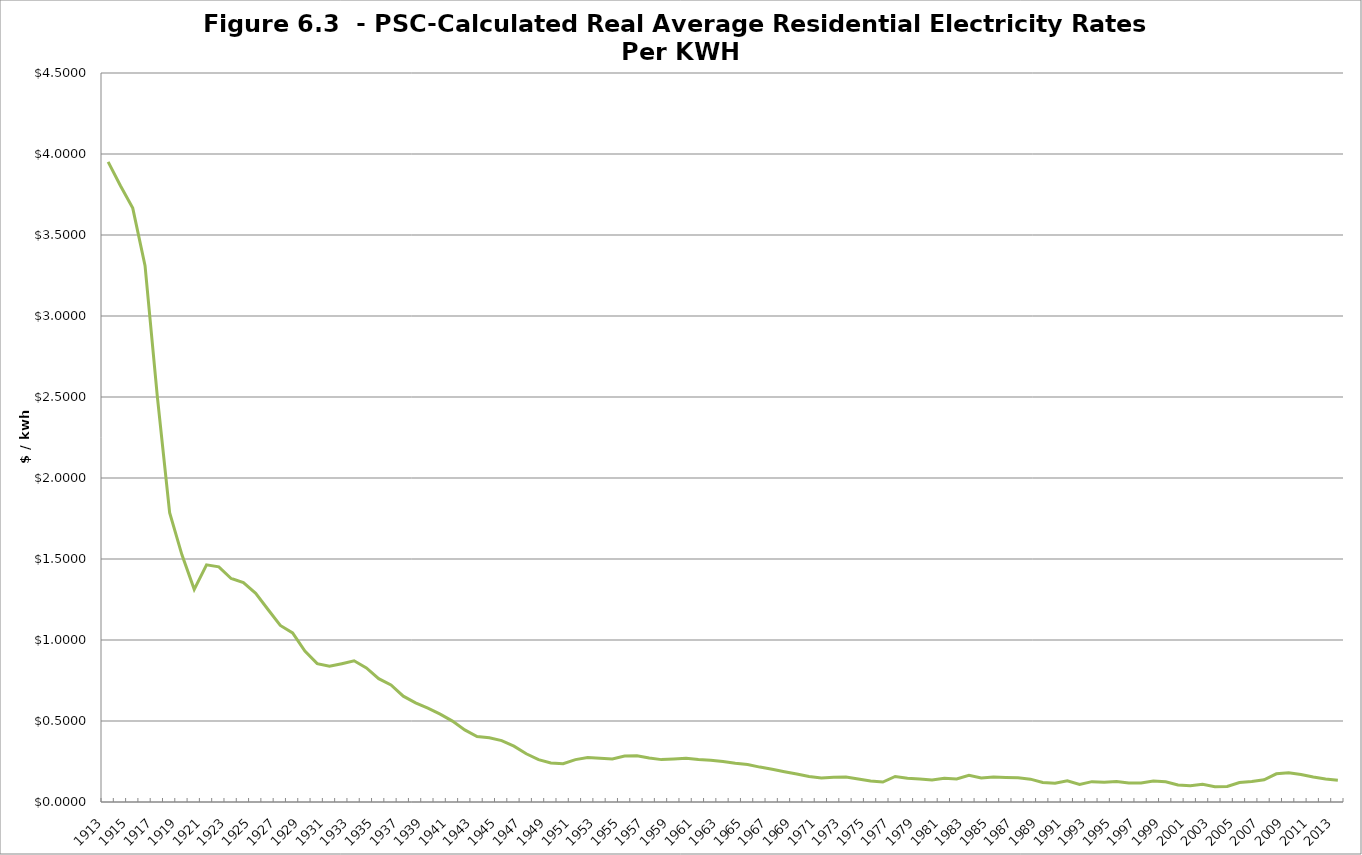
| Category | Real Rates 
per kwh |
|---|---|
| 1913.0 | 3.951 |
| 1914.0 | 3.804 |
| 1915.0 | 3.666 |
| 1916.0 | 3.311 |
| 1917.0 | 2.503 |
| 1918.0 | 1.786 |
| 1919.0 | 1.526 |
| 1920.0 | 1.313 |
| 1921.0 | 1.464 |
| 1922.0 | 1.451 |
| 1923.0 | 1.38 |
| 1924.0 | 1.354 |
| 1925.0 | 1.288 |
| 1926.0 | 1.188 |
| 1927.0 | 1.09 |
| 1928.0 | 1.044 |
| 1929.0 | 0.932 |
| 1930.0 | 0.854 |
| 1931.0 | 0.837 |
| 1932.0 | 0.854 |
| 1933.0 | 0.872 |
| 1934.0 | 0.827 |
| 1935.0 | 0.762 |
| 1936.0 | 0.722 |
| 1937.0 | 0.653 |
| 1938.0 | 0.612 |
| 1939.0 | 0.579 |
| 1940.0 | 0.543 |
| 1941.0 | 0.499 |
| 1942.0 | 0.445 |
| 1943.0 | 0.405 |
| 1944.0 | 0.396 |
| 1945.0 | 0.379 |
| 1946.0 | 0.345 |
| 1947.0 | 0.298 |
| 1948.0 | 0.261 |
| 1949.0 | 0.241 |
| 1950.0 | 0.236 |
| 1951.0 | 0.262 |
| 1952.0 | 0.275 |
| 1953.0 | 0.27 |
| 1954.0 | 0.265 |
| 1955.0 | 0.284 |
| 1956.0 | 0.285 |
| 1957.0 | 0.272 |
| 1958.0 | 0.262 |
| 1959.0 | 0.266 |
| 1960.0 | 0.271 |
| 1961.0 | 0.262 |
| 1962.0 | 0.258 |
| 1963.0 | 0.25 |
| 1964.0 | 0.24 |
| 1965.0 | 0.232 |
| 1966.0 | 0.215 |
| 1967.0 | 0.203 |
| 1968.0 | 0.187 |
| 1969.0 | 0.172 |
| 1970.0 | 0.157 |
| 1971.0 | 0.149 |
| 1972.0 | 0.153 |
| 1973.0 | 0.155 |
| 1974.0 | 0.142 |
| 1975.0 | 0.13 |
| 1976.0 | 0.123 |
| 1977.0 | 0.157 |
| 1978.0 | 0.147 |
| 1979.0 | 0.142 |
| 1980.0 | 0.136 |
| 1981.0 | 0.146 |
| 1982.0 | 0.142 |
| 1983.0 | 0.165 |
| 1984.0 | 0.148 |
| 1985.0 | 0.154 |
| 1986.0 | 0.152 |
| 1987.0 | 0.15 |
| 1988.0 | 0.141 |
| 1989.0 | 0.12 |
| 1990.0 | 0.115 |
| 1991.0 | 0.131 |
| 1992.0 | 0.108 |
| 1993.0 | 0.126 |
| 1994.0 | 0.122 |
| 1995.0 | 0.127 |
| 1996.0 | 0.118 |
| 1997.0 | 0.117 |
| 1998.0 | 0.129 |
| 1999.0 | 0.125 |
| 2000.0 | 0.105 |
| 2001.0 | 0.1 |
| 2002.0 | 0.11 |
| 2003.0 | 0.095 |
| 2004.0 | 0.096 |
| 2005.0 | 0.121 |
| 2006.0 | 0.126 |
| 2007.0 | 0.137 |
| 2008.0 | 0.174 |
| 2009.0 | 0.18 |
| 2010.0 | 0.17 |
| 2011.0 | 0.154 |
| 2012.0 | 0.141 |
| 2013.0 | 0.134 |